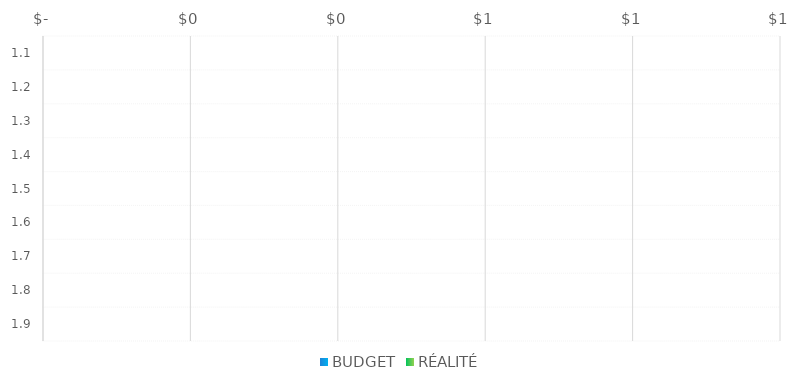
| Category | BUDGET | RÉALITÉ |
|---|---|---|
| 1.1 |  | 0 |
| 1.2 |  | 0 |
| 1.3 |  | 0 |
| 1.4 |  | 0 |
| 1.5 |  | 0 |
| 1.6 |  | 0 |
| 1.7 |  | 0 |
| 1.8 |  | 0 |
| 1.9 |  | 0 |